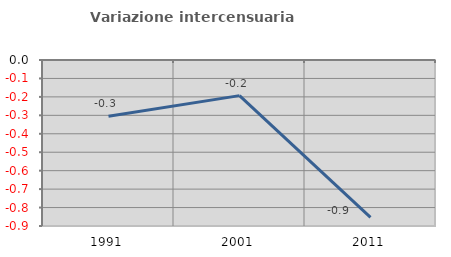
| Category | Variazione intercensuaria annua |
|---|---|
| 1991.0 | -0.305 |
| 2001.0 | -0.193 |
| 2011.0 | -0.853 |